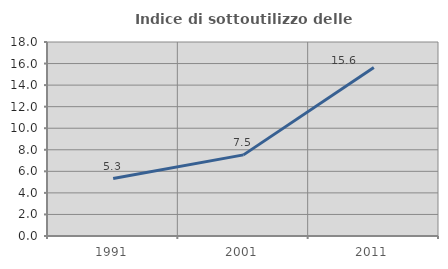
| Category | Indice di sottoutilizzo delle abitazioni  |
|---|---|
| 1991.0 | 5.333 |
| 2001.0 | 7.527 |
| 2011.0 | 15.625 |